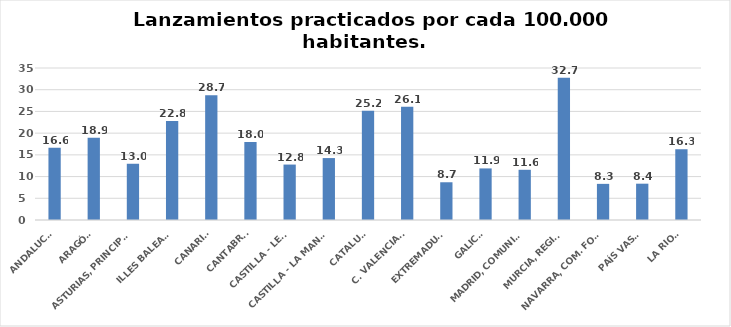
| Category | Series 0 |
|---|---|
| ANDALUCÍA | 16.63 |
| ARAGÓN | 18.938 |
| ASTURIAS, PRINCIPADO | 12.95 |
| ILLES BALEARS | 22.775 |
| CANARIAS | 28.738 |
| CANTABRIA | 17.97 |
| CASTILLA - LEÓN | 12.766 |
| CASTILLA - LA MANCHA | 14.259 |
| CATALUÑA | 25.152 |
| C. VALENCIANA | 26.082 |
| EXTREMADURA | 8.689 |
| GALICIA | 11.877 |
| MADRID, COMUNIDAD | 11.563 |
| MURCIA, REGIÓN | 32.742 |
| NAVARRA, COM. FORAL | 8.32 |
| PAÍS VASCO | 8.361 |
| LA RIOJA | 16.29 |